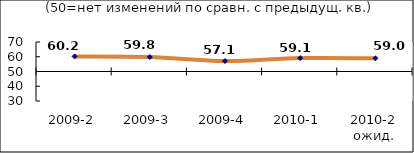
| Category | Диф.индекс ↓ |
|---|---|
| 2009-2 | 60.22 |
| 2009-3 | 59.79 |
| 2009-4 | 57.085 |
| 2010-1 | 59.075 |
| 2010-2 ожид. | 58.955 |